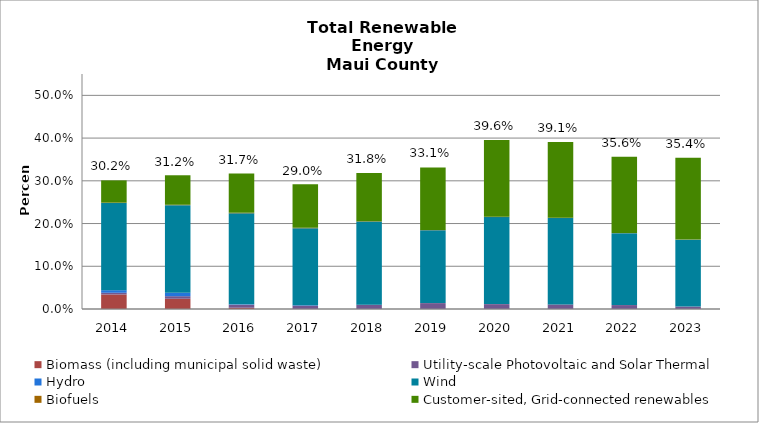
| Category | Biomass (including municipal solid waste) | Utility-scale Photovoltaic and Solar Thermal | Hydro | Wind | Biofuels | Customer-sited, Grid-connected renewables |
|---|---|---|---|---|---|---|
| 2014.0 | 0.034 | 0.004 | 0.006 | 0.204 | 0.001 | 0.052 |
| 2015.0 | 0.024 | 0.006 | 0.008 | 0.205 | 0.001 | 0.069 |
| 2016.0 | 0.003 | 0.007 | 0.001 | 0.213 | 0.001 | 0.092 |
| 2017.0 | 0 | 0.008 | 0.001 | 0.18 | 0.001 | 0.102 |
| 2018.0 | 0 | 0.01 | 0 | 0.195 | 0.001 | 0.113 |
| 2019.0 | 0 | 0.014 | 0 | 0.171 | 0.001 | 0.146 |
| 2020.0 | 0 | 0.011 | 0 | 0.204 | 0.001 | 0.18 |
| 2021.0 | 0 | 0.011 | 0 | 0.202 | 0.001 | 0.177 |
| 2022.0 | 0 | 0.009 | 0 | 0.168 | 0 | 0.178 |
| 2023.0 | 0 | 0.006 | 0 | 0.157 | 0 | 0.191 |